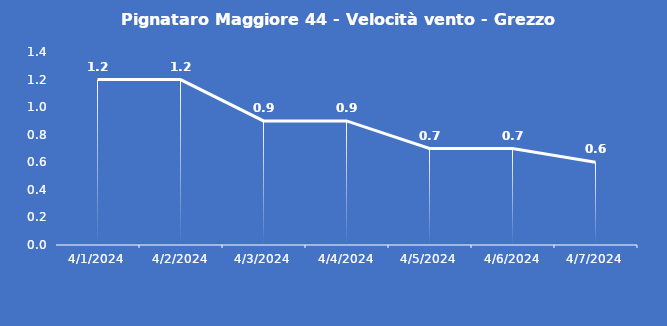
| Category | Pignataro Maggiore 44 - Velocità vento - Grezzo (m/s) |
|---|---|
| 4/1/24 | 1.2 |
| 4/2/24 | 1.2 |
| 4/3/24 | 0.9 |
| 4/4/24 | 0.9 |
| 4/5/24 | 0.7 |
| 4/6/24 | 0.7 |
| 4/7/24 | 0.6 |